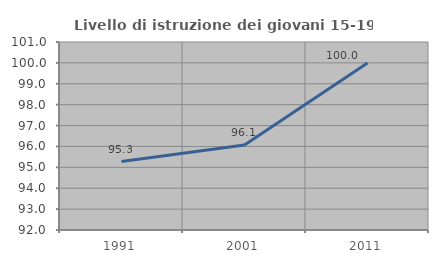
| Category | Livello di istruzione dei giovani 15-19 anni |
|---|---|
| 1991.0 | 95.276 |
| 2001.0 | 96.067 |
| 2011.0 | 100 |